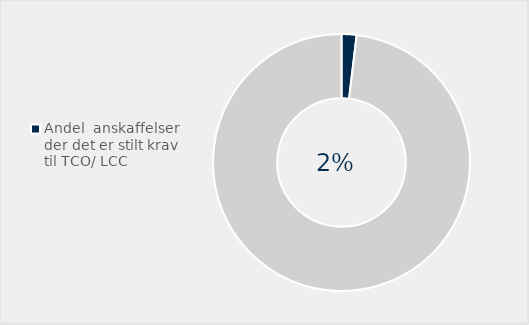
| Category | Series 0 |
|---|---|
| Andel  anskaffelser der det er stilt krav til TCO/ LCC | 0.019 |
| Ikke stilt krav  | 0.981 |